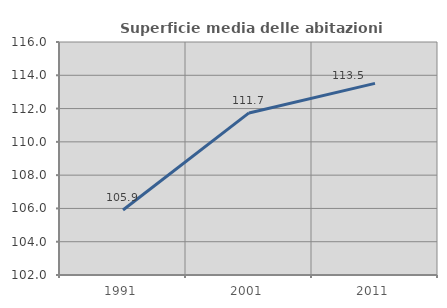
| Category | Superficie media delle abitazioni occupate |
|---|---|
| 1991.0 | 105.903 |
| 2001.0 | 111.739 |
| 2011.0 | 113.512 |